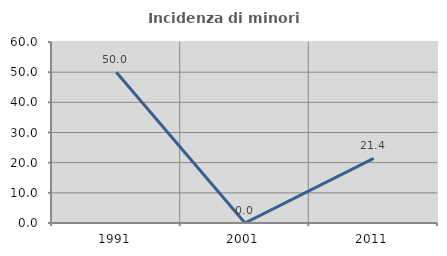
| Category | Incidenza di minori stranieri |
|---|---|
| 1991.0 | 50 |
| 2001.0 | 0 |
| 2011.0 | 21.429 |